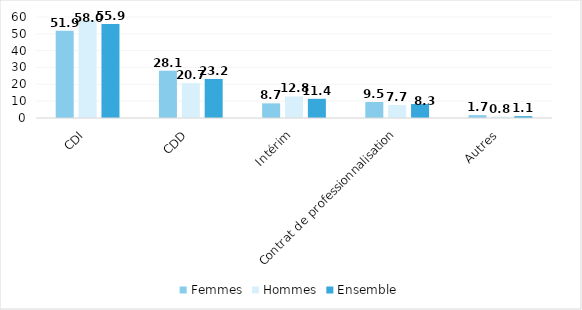
| Category | Femmes | Hommes | Ensemble |
|---|---|---|---|
| CDI | 51.9 | 58 | 55.9 |
| CDD | 28.1 | 20.7 | 23.2 |
| Intérim | 8.7 | 12.8 | 11.4 |
| Contrat de professionnalisation | 9.5 | 7.7 | 8.3 |
| Autres | 1.7 | 0.8 | 1.1 |